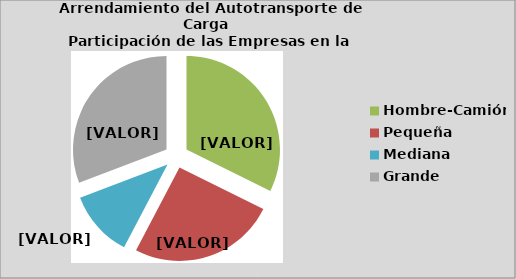
| Category | Series 0 |
|---|---|
| Hombre-Camión | 32.308 |
| Pequeña | 25.385 |
| Mediana | 11.538 |
| Grande | 30.769 |